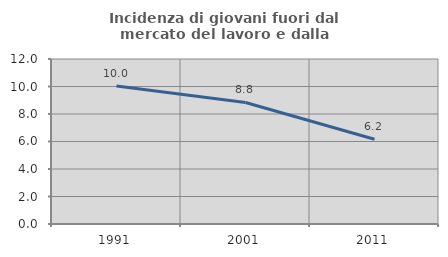
| Category | Incidenza di giovani fuori dal mercato del lavoro e dalla formazione  |
|---|---|
| 1991.0 | 10.035 |
| 2001.0 | 8.839 |
| 2011.0 | 6.164 |